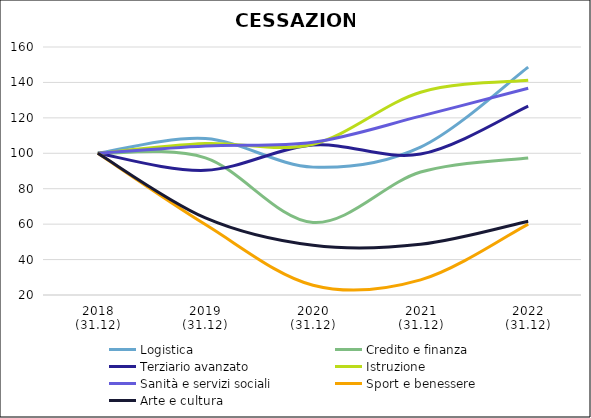
| Category | Logistica | Credito e finanza | Terziario avanzato | Istruzione | Sanità e servizi sociali | Sport e benessere | Arte e cultura |
|---|---|---|---|---|---|---|---|
| 2018
(31.12) | 100 | 100 | 100 | 100 | 100 | 100 | 100 |
| 2019
(31.12) | 108.33 | 97.396 | 90.392 | 105.495 | 104.123 | 59.783 | 63.515 |
| 2020
(31.12) | 92.187 | 60.938 | 104.673 | 105.148 | 106.194 | 25.543 | 48.053 |
| 2021
(31.12) | 103.496 | 89.41 | 99.565 | 134.491 | 120.959 | 28.533 | 48.61 |
| 2022
(31.12) | 148.624 | 97.396 | 126.676 | 141.283 | 136.738 | 60.054 | 61.624 |